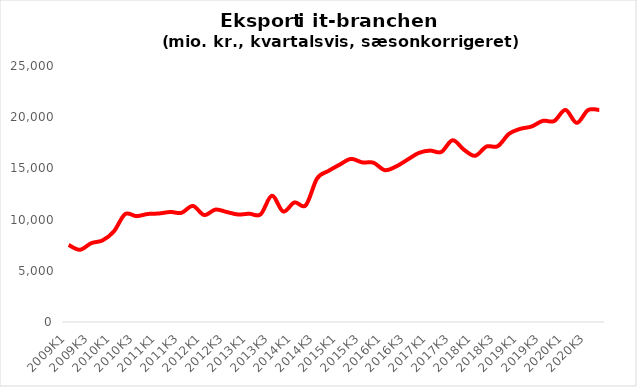
| Category | Samlet eksport i It-branchen |
|---|---|
| 2009K1 | 7522.863 |
| 2009K2 | 7053.745 |
| 2009K3 | 7697.261 |
| 2009K4 | 7967.523 |
| 2010K1 | 8836.777 |
| 2010K2 | 10533.794 |
| 2010K3 | 10336.385 |
| 2010K4 | 10548.904 |
| 2011K1 | 10596.488 |
| 2011K2 | 10742.366 |
| 2011K3 | 10666.124 |
| 2011K4 | 11333.402 |
| 2012K1 | 10446.952 |
| 2012K2 | 10976.654 |
| 2012K3 | 10743.226 |
| 2012K4 | 10497.137 |
| 2013K1 | 10574.416 |
| 2013K2 | 10511.316 |
| 2013K3 | 12334.255 |
| 2013K4 | 10791.253 |
| 2014K1 | 11677.415 |
| 2014K2 | 11392.489 |
| 2014K3 | 14014.579 |
| 2014K4 | 14746.617 |
| 2015K1 | 15366.032 |
| 2015K2 | 15927.828 |
| 2015K3 | 15586.535 |
| 2015K4 | 15552.917 |
| 2016K1 | 14829.097 |
| 2016K2 | 15187.565 |
| 2016K3 | 15846.837 |
| 2016K4 | 16506.536 |
| 2017K1 | 16740.264 |
| 2017K2 | 16603.803 |
| 2017K3 | 17751.629 |
| 2017K4 | 16833.847 |
| 2018K1 | 16230.648 |
| 2018K2 | 17133.624 |
| 2018K3 | 17169.331 |
| 2018K4 | 18376.743 |
| 2019K1 | 18862.107 |
| 2019K2 | 19092.466 |
| 2019K3 | 19645.354 |
| 2019K4 | 19624.902 |
| 2020K1 | 20709.601 |
| 2020K2 | 19443.111 |
| 2020K3 | 20697.629 |
| 2020K4 | 20705.158 |